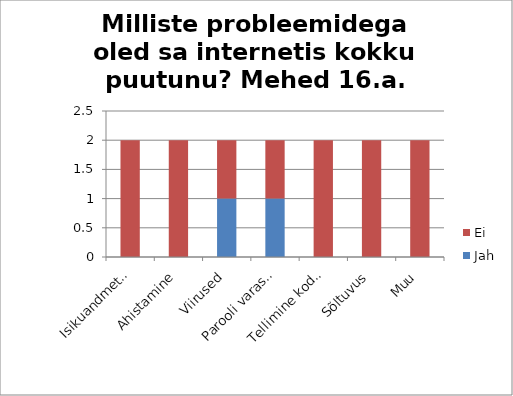
| Category | Jah | Ei |
|---|---|---|
| Isikuandmete pealtkuulamine | 0 | 2 |
| Ahistamine | 0 | 2 |
| Viirused | 1 | 1 |
| Parooli varastamine | 1 | 1 |
| Tellimine kodulehelt, maksid, said midagi muud | 0 | 2 |
| Sõltuvus | 0 | 2 |
| Muu | 0 | 2 |